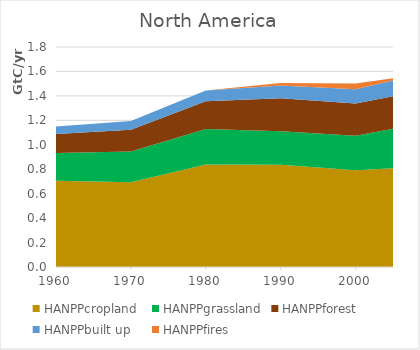
| Category | HANPPcropland | HANPPgrassland | HANPPforest | HANPPbuilt up | HANPPfires |
|---|---|---|---|---|---|
| 1960.0 | 704880.591 | 228012.762 | 154525.56 | 61856.776 | 0 |
| 1970.0 | 693040.018 | 251635.709 | 177848.591 | 72853.714 | 0 |
| 1980.0 | 839442.35 | 290010.827 | 226552.07 | 87109.718 | 0 |
| 1990.0 | 836710.998 | 274841.272 | 268947.255 | 103766.78 | 21005.28 |
| 2000.0 | 791619.856 | 282003.523 | 263477.06 | 116403.709 | 47322.24 |
| 2005.0 | 807769.536 | 323571.527 | 264826.952 | 130676.156 | 17544.64 |